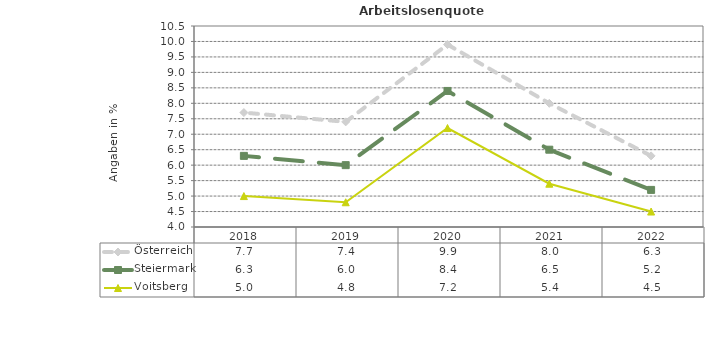
| Category | Österreich | Steiermark | Voitsberg |
|---|---|---|---|
| 2022.0 | 6.3 | 5.2 | 4.5 |
| 2021.0 | 8 | 6.5 | 5.4 |
| 2020.0 | 9.9 | 8.4 | 7.2 |
| 2019.0 | 7.4 | 6 | 4.8 |
| 2018.0 | 7.7 | 6.3 | 5 |